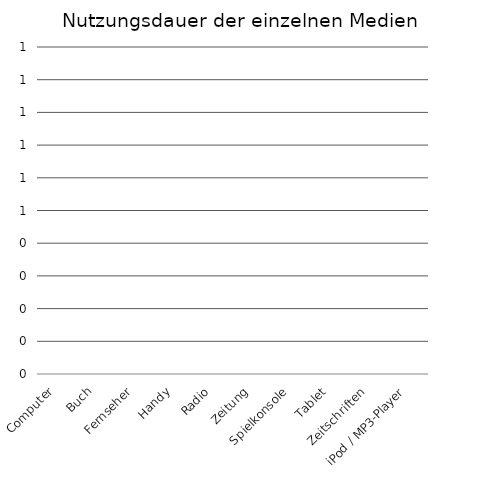
| Category | Series 0 |
|---|---|
| Computer | 0 |
| Buch | 0 |
| Fernseher | 0 |
| Handy | 0 |
| Radio | 0 |
| Zeitung | 0 |
| Spielkonsole | 0 |
| Tablet | 0 |
| Zeitschriften | 0 |
| iPod / MP3-Player | 0 |